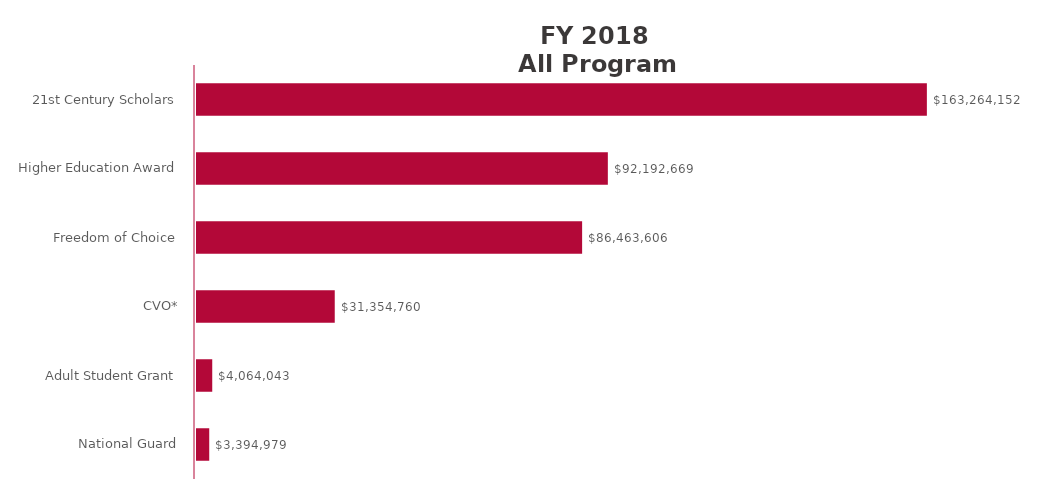
| Category | Series 0 |
|---|---|
| National Guard | 3394979.21 |
| Adult Student Grant | 4064043.36 |
| CVO* | 31354759.95 |
| Freedom of Choice | 86463606.41 |
| Higher Education Award | 92192669.37 |
| 21st Century Scholars | 163264152.38 |